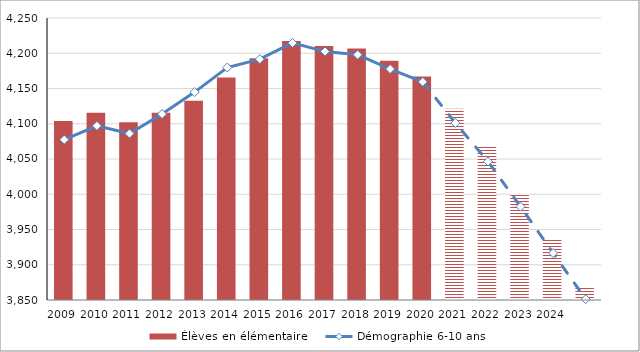
| Category | Élèves en élémentaire |
|---|---|
| 2009.0 | 4103.9 |
| 2010.0 | 4115.5 |
| 2011.0 | 4102.1 |
| 2012.0 | 4115.7 |
| 2013.0 | 4132.6 |
| 2014.0 | 4165.7 |
| 2015.0 | 4193 |
| 2016.0 | 4217.5 |
| 2017.0 | 4210.4 |
| 2018.0 | 4206.6 |
| 2019.0 | 4189.4 |
| 2020.0 | 4167 |
| 2021.0 | 4121.2 |
| 2022.0 | 4067.4 |
| 2023.0 | 4000.3 |
| 2024.0 | 3935.5 |